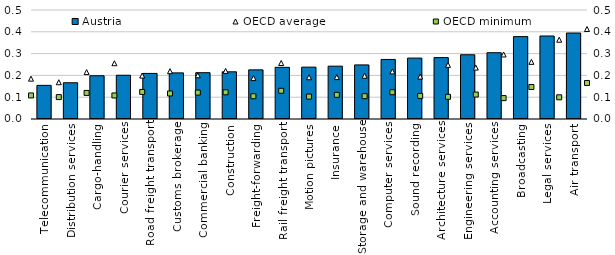
| Category | Austria |
|---|---|
| Telecommunication | 0.154 |
| Distribution services | 0.166 |
| Cargo-handling | 0.198 |
| Courier services | 0.201 |
| Road freight transport | 0.209 |
| Customs brokerage | 0.212 |
| Commercial banking | 0.212 |
| Construction | 0.216 |
| Freight-forwarding | 0.225 |
| Rail freight transport | 0.237 |
| Motion pictures | 0.238 |
| Insurance | 0.242 |
| Storage and warehouse | 0.248 |
| Computer services | 0.273 |
| Sound recording | 0.279 |
| Architecture services | 0.282 |
| Engineering services | 0.295 |
| Accounting services | 0.304 |
| Broadcasting | 0.378 |
| Legal services | 0.381 |
| Air transport | 0.394 |